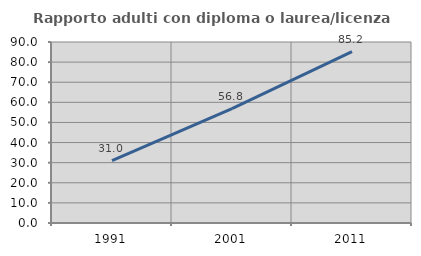
| Category | Rapporto adulti con diploma o laurea/licenza media  |
|---|---|
| 1991.0 | 31.019 |
| 2001.0 | 56.822 |
| 2011.0 | 85.188 |